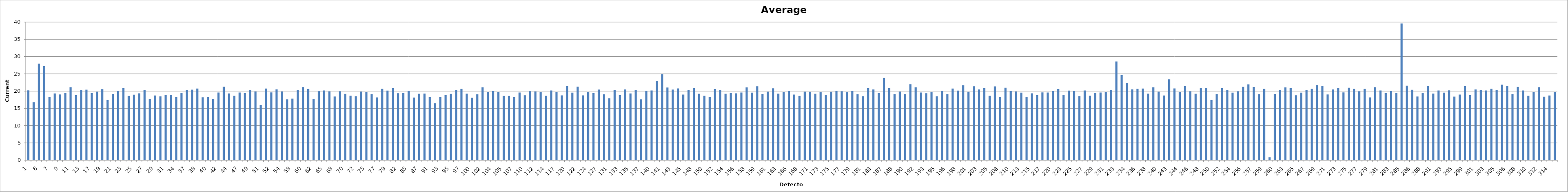
| Category | Average [pA] |
|---|---|
| 1.0 | 20.198 |
| 4.0 | 16.772 |
| 6.0 | 27.952 |
| 6.0 | 27.23 |
| 7.0 | 18.294 |
| 8.0 | 19.334 |
| 9.0 | 19.02 |
| 10.0 | 19.508 |
| 11.0 | 21.12 |
| 12.0 | 18.824 |
| 13.0 | 20.368 |
| 14.0 | 20.4 |
| 17.0 | 19.414 |
| 18.0 | 19.82 |
| 19.0 | 20.568 |
| 20.0 | 17.424 |
| 21.0 | 19.18 |
| 22.0 | 20.086 |
| 23.0 | 20.834 |
| 24.0 | 18.608 |
| 25.0 | 18.968 |
| 26.0 | 19.362 |
| 27.0 | 20.298 |
| 28.0 | 17.638 |
| 29.0 | 18.726 |
| 30.0 | 18.448 |
| 31.0 | 18.886 |
| 32.0 | 18.902 |
| 34.0 | 18.25 |
| 36.0 | 19.524 |
| 37.0 | 20.276 |
| 38.0 | 20.42 |
| 38.0 | 20.728 |
| 39.0 | 18.202 |
| 40.0 | 18.29 |
| 41.0 | 17.67 |
| 42.0 | 19.584 |
| 43.0 | 21.272 |
| 44.0 | 19.328 |
| 45.0 | 18.638 |
| 47.0 | 19.598 |
| 48.0 | 19.468 |
| 49.0 | 20.354 |
| 50.0 | 19.878 |
| 51.0 | 15.986 |
| 51.0 | 20.752 |
| 52.0 | 19.614 |
| 53.0 | 20.512 |
| 54.0 | 19.876 |
| 57.0 | 17.614 |
| 58.0 | 17.802 |
| 59.0 | 20.316 |
| 60.0 | 21.14 |
| 61.0 | 20.626 |
| 62.0 | 17.754 |
| 64.0 | 19.978 |
| 65.0 | 20.182 |
| 66.0 | 19.908 |
| 68.0 | 18.438 |
| 69.0 | 19.932 |
| 70.0 | 19.204 |
| 71.0 | 18.66 |
| 72.0 | 18.532 |
| 74.0 | 19.846 |
| 75.0 | 19.778 |
| 76.0 | 19.136 |
| 77.0 | 18.154 |
| 78.0 | 20.694 |
| 79.0 | 20.136 |
| 81.0 | 20.824 |
| 82.0 | 19.366 |
| 83.0 | 19.474 |
| 85.0 | 20.122 |
| 86.0 | 18.136 |
| 87.0 | 19.218 |
| 88.0 | 19.294 |
| 91.0 | 18.216 |
| 92.0 | 16.464 |
| 93.0 | 18.22 |
| 94.0 | 18.856 |
| 95.0 | 19.212 |
| 96.0 | 20.304 |
| 97.0 | 20.648 |
| 99.0 | 19.25 |
| 100.0 | 18.12 |
| 101.0 | 19.056 |
| 102.0 | 21.106 |
| 103.0 | 19.76 |
| 104.0 | 19.994 |
| 105.0 | 19.772 |
| 105.0 | 18.618 |
| 106.0 | 18.622 |
| 107.0 | 18.232 |
| 108.0 | 19.596 |
| 110.0 | 18.784 |
| 111.0 | 19.974 |
| 112.0 | 19.872 |
| 113.0 | 19.69 |
| 114.0 | 18.652 |
| 116.0 | 20.18 |
| 117.0 | 19.772 |
| 118.0 | 18.752 |
| 120.0 | 21.492 |
| 121.0 | 19.548 |
| 122.0 | 21.312 |
| 123.0 | 18.762 |
| 124.0 | 19.692 |
| 126.0 | 19.408 |
| 127.0 | 20.434 |
| 130.0 | 19.052 |
| 131.0 | 17.922 |
| 132.0 | 20.268 |
| 133.0 | 18.83 |
| 134.0 | 20.474 |
| 135.0 | 19.32 |
| 136.0 | 20.352 |
| 137.0 | 17.602 |
| 138.0 | 20.122 |
| 140.0 | 20.19 |
| 141.0 | 22.846 |
| 141.0 | 24.88 |
| 142.0 | 21.046 |
| 143.0 | 20.44 |
| 144.0 | 20.764 |
| 145.0 | 18.98 |
| 147.0 | 20.24 |
| 148.0 | 20.902 |
| 149.0 | 19.216 |
| 150.0 | 18.644 |
| 151.0 | 18.282 |
| 152.0 | 20.594 |
| 153.0 | 20.278 |
| 154.0 | 19.218 |
| 155.0 | 19.464 |
| 156.0 | 19.35 |
| 157.0 | 19.58 |
| 158.0 | 21.066 |
| 159.0 | 19.544 |
| 159.0 | 21.398 |
| 160.0 | 19.174 |
| 161.0 | 19.826 |
| 162.0 | 20.804 |
| 163.0 | 19.262 |
| 165.0 | 19.742 |
| 166.0 | 20.062 |
| 167.0 | 18.994 |
| 168.0 | 18.616 |
| 170.0 | 19.83 |
| 171.0 | 19.78 |
| 172.0 | 19.216 |
| 173.0 | 19.688 |
| 174.0 | 18.936 |
| 175.0 | 19.796 |
| 176.0 | 20.1 |
| 177.0 | 19.954 |
| 178.0 | 19.672 |
| 179.0 | 20.066 |
| 180.0 | 19.098 |
| 181.0 | 18.52 |
| 182.0 | 20.828 |
| 183.0 | 20.466 |
| 184.0 | 19.46 |
| 187.0 | 23.806 |
| 187.0 | 20.862 |
| 188.0 | 19.156 |
| 189.0 | 19.86 |
| 190.0 | 19.142 |
| 191.0 | 21.98 |
| 192.0 | 21.098 |
| 192.0 | 19.586 |
| 193.0 | 19.368 |
| 194.0 | 19.672 |
| 195.0 | 18.478 |
| 196.0 | 20.116 |
| 196.0 | 19.156 |
| 197.0 | 20.744 |
| 198.0 | 20.158 |
| 200.0 | 21.682 |
| 201.0 | 19.802 |
| 202.0 | 21.386 |
| 203.0 | 20.466 |
| 204.0 | 20.834 |
| 205.0 | 18.644 |
| 207.0 | 21.374 |
| 208.0 | 18.286 |
| 209.0 | 20.99 |
| 210.0 | 19.99 |
| 212.0 | 19.888 |
| 213.0 | 19.566 |
| 214.0 | 18.334 |
| 215.0 | 19.344 |
| 216.0 | 18.824 |
| 217.0 | 19.62 |
| 219.0 | 19.586 |
| 220.0 | 19.996 |
| 222.0 | 20.606 |
| 223.0 | 18.946 |
| 224.0 | 20.162 |
| 225.0 | 20.05 |
| 226.0 | 18.544 |
| 227.0 | 20.178 |
| 228.0 | 18.672 |
| 229.0 | 19.494 |
| 230.0 | 19.6 |
| 231.0 | 19.762 |
| 232.0 | 20.238 |
| 233.0 | 28.58 |
| 233.0 | 24.642 |
| 234.0 | 22.374 |
| 235.0 | 20.496 |
| 236.0 | 20.688 |
| 237.0 | 20.73 |
| 238.0 | 19.254 |
| 239.0 | 21.082 |
| 240.0 | 19.832 |
| 241.0 | 18.736 |
| 243.0 | 23.402 |
| 243.0 | 20.768 |
| 244.0 | 19.726 |
| 245.0 | 21.482 |
| 246.0 | 19.94 |
| 247.0 | 19.216 |
| 248.0 | 20.954 |
| 249.0 | 20.934 |
| 250.0 | 17.43 |
| 251.0 | 19.15 |
| 252.0 | 20.824 |
| 253.0 | 20.302 |
| 254.0 | 19.552 |
| 255.0 | 19.94 |
| 256.0 | 21.238 |
| 256.0 | 21.942 |
| 257.0 | 21.19 |
| 258.0 | 19.106 |
| 259.0 | 20.646 |
| 260.0 | 0.81 |
| 260.0 | 19.172 |
| 261.0 | 20.34 |
| 263.0 | 21.056 |
| 264.0 | 20.834 |
| 265.0 | 18.784 |
| 266.0 | 19.568 |
| 267.0 | 20.304 |
| 268.0 | 20.684 |
| 269.0 | 21.756 |
| 270.0 | 21.55 |
| 271.0 | 19.036 |
| 272.0 | 20.486 |
| 273.0 | 20.908 |
| 274.0 | 19.626 |
| 275.0 | 20.974 |
| 276.0 | 20.64 |
| 277.0 | 19.954 |
| 278.0 | 20.664 |
| 279.0 | 18.162 |
| 280.0 | 21.138 |
| 281.0 | 20.164 |
| 282.0 | 19.432 |
| 283.0 | 20.03 |
| 284.0 | 19.496 |
| 285.0 | 39.592 |
| 285.0 | 21.562 |
| 286.0 | 20.378 |
| 287.0 | 18.438 |
| 288.0 | 19.528 |
| 289.0 | 21.512 |
| 291.0 | 19.284 |
| 292.0 | 20.164 |
| 293.0 | 19.55 |
| 294.0 | 20.196 |
| 295.0 | 18.416 |
| 297.0 | 18.988 |
| 299.0 | 21.442 |
| 300.0 | 18.81 |
| 301.0 | 20.468 |
| 302.0 | 20.266 |
| 303.0 | 20.188 |
| 304.0 | 20.722 |
| 305.0 | 20.318 |
| 306.0 | 21.864 |
| 306.0 | 21.478 |
| 307.0 | 19.146 |
| 308.0 | 21.216 |
| 309.0 | 20.166 |
| 310.0 | 18.64 |
| 311.0 | 19.756 |
| 312.0 | 21.134 |
| 313.0 | 18.366 |
| 314.0 | 18.718 |
| 315.0 | 19.74 |